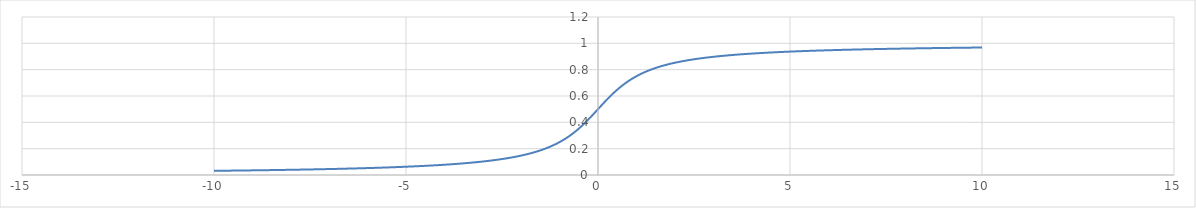
| Category | Series 0 |
|---|---|
| -10.0 | 0.032 |
| -9.9 | 0.032 |
| -9.8 | 0.032 |
| -9.7 | 0.033 |
| -9.6 | 0.033 |
| -9.5 | 0.033 |
| -9.4 | 0.034 |
| -9.3 | 0.034 |
| -9.2 | 0.034 |
| -9.1 | 0.035 |
| -9.0 | 0.035 |
| -8.9 | 0.036 |
| -8.8 | 0.036 |
| -8.7 | 0.036 |
| -8.6 | 0.037 |
| -8.50000000000001 | 0.037 |
| -8.40000000000001 | 0.038 |
| -8.30000000000001 | 0.038 |
| -8.20000000000001 | 0.039 |
| -8.10000000000001 | 0.039 |
| -8.00000000000001 | 0.04 |
| -7.90000000000001 | 0.04 |
| -7.80000000000001 | 0.041 |
| -7.70000000000001 | 0.041 |
| -7.60000000000001 | 0.042 |
| -7.50000000000001 | 0.042 |
| -7.40000000000001 | 0.043 |
| -7.30000000000001 | 0.043 |
| -7.20000000000001 | 0.044 |
| -7.10000000000001 | 0.045 |
| -7.00000000000001 | 0.045 |
| -6.90000000000001 | 0.046 |
| -6.80000000000001 | 0.046 |
| -6.70000000000001 | 0.047 |
| -6.60000000000001 | 0.048 |
| -6.50000000000001 | 0.049 |
| -6.40000000000001 | 0.049 |
| -6.30000000000001 | 0.05 |
| -6.20000000000001 | 0.051 |
| -6.10000000000001 | 0.052 |
| -6.00000000000001 | 0.053 |
| -5.90000000000001 | 0.053 |
| -5.80000000000001 | 0.054 |
| -5.70000000000002 | 0.055 |
| -5.60000000000002 | 0.056 |
| -5.50000000000002 | 0.057 |
| -5.40000000000002 | 0.058 |
| -5.30000000000002 | 0.059 |
| -5.20000000000002 | 0.06 |
| -5.10000000000002 | 0.062 |
| -5.00000000000002 | 0.063 |
| -4.90000000000002 | 0.064 |
| -4.80000000000002 | 0.065 |
| -4.70000000000002 | 0.067 |
| -4.60000000000002 | 0.068 |
| -4.50000000000002 | 0.07 |
| -4.40000000000002 | 0.071 |
| -4.30000000000002 | 0.073 |
| -4.20000000000002 | 0.074 |
| -4.10000000000002 | 0.076 |
| -4.00000000000002 | 0.078 |
| -3.90000000000002 | 0.08 |
| -3.80000000000002 | 0.082 |
| -3.70000000000002 | 0.084 |
| -3.60000000000002 | 0.086 |
| -3.50000000000002 | 0.089 |
| -3.40000000000002 | 0.091 |
| -3.30000000000002 | 0.094 |
| -3.20000000000002 | 0.096 |
| -3.10000000000002 | 0.099 |
| -3.00000000000002 | 0.102 |
| -2.90000000000003 | 0.106 |
| -2.80000000000003 | 0.109 |
| -2.70000000000003 | 0.113 |
| -2.60000000000003 | 0.117 |
| -2.50000000000003 | 0.121 |
| -2.40000000000003 | 0.126 |
| -2.30000000000003 | 0.131 |
| -2.20000000000003 | 0.136 |
| -2.10000000000003 | 0.141 |
| -2.00000000000003 | 0.148 |
| -1.90000000000003 | 0.154 |
| -1.80000000000003 | 0.161 |
| -1.70000000000003 | 0.169 |
| -1.60000000000003 | 0.178 |
| -1.50000000000003 | 0.187 |
| -1.40000000000003 | 0.197 |
| -1.30000000000003 | 0.209 |
| -1.20000000000003 | 0.221 |
| -1.10000000000003 | 0.235 |
| -1.00000000000003 | 0.25 |
| -0.900000000000031 | 0.267 |
| -0.800000000000029 | 0.285 |
| -0.700000000000029 | 0.306 |
| -0.60000000000003 | 0.328 |
| -0.50000000000003 | 0.352 |
| -0.400000000000031 | 0.379 |
| -0.300000000000029 | 0.407 |
| -0.200000000000029 | 0.437 |
| -0.100000000000041 | 0.468 |
| -4.08562073062058e-14 | 0.5 |
| 0.0999999999999996 | 0.532 |
| 0.199999999999999 | 0.563 |
| 0.300000000000001 | 0.593 |
| 0.4 | 0.621 |
| 0.5 | 0.648 |
| 0.6 | 0.672 |
| 0.699999999999999 | 0.694 |
| 0.800000000000001 | 0.715 |
| 0.9 | 0.733 |
| 1.0 | 0.75 |
| 1.1 | 0.765 |
| 1.2 | 0.779 |
| 1.3 | 0.791 |
| 1.4 | 0.803 |
| 1.5 | 0.813 |
| 1.6 | 0.822 |
| 1.7 | 0.831 |
| 1.8 | 0.839 |
| 1.9 | 0.846 |
| 2.0 | 0.852 |
| 2.1 | 0.859 |
| 2.2 | 0.864 |
| 2.3 | 0.869 |
| 2.4 | 0.874 |
| 2.5 | 0.879 |
| 2.6 | 0.883 |
| 2.7 | 0.887 |
| 2.8 | 0.891 |
| 2.9 | 0.894 |
| 3.0 | 0.898 |
| 3.1 | 0.901 |
| 3.2 | 0.904 |
| 3.3 | 0.906 |
| 3.4 | 0.909 |
| 3.5 | 0.911 |
| 3.6 | 0.914 |
| 3.7 | 0.916 |
| 3.8 | 0.918 |
| 3.9 | 0.92 |
| 4.0 | 0.922 |
| 4.0999999999999 | 0.924 |
| 4.1999999999999 | 0.926 |
| 4.2999999999999 | 0.927 |
| 4.3999999999999 | 0.929 |
| 4.4999999999999 | 0.93 |
| 4.5999999999999 | 0.932 |
| 4.6999999999999 | 0.933 |
| 4.7999999999999 | 0.935 |
| 4.8999999999999 | 0.936 |
| 4.9999999999999 | 0.937 |
| 5.0999999999999 | 0.938 |
| 5.1999999999999 | 0.94 |
| 5.2999999999999 | 0.941 |
| 5.3999999999999 | 0.942 |
| 5.4999999999999 | 0.943 |
| 5.5999999999999 | 0.944 |
| 5.6999999999999 | 0.945 |
| 5.7999999999999 | 0.946 |
| 5.8999999999999 | 0.947 |
| 5.9999999999999 | 0.947 |
| 6.0999999999999 | 0.948 |
| 6.1999999999999 | 0.949 |
| 6.2999999999999 | 0.95 |
| 6.3999999999999 | 0.951 |
| 6.4999999999999 | 0.951 |
| 6.5999999999999 | 0.952 |
| 6.6999999999999 | 0.953 |
| 6.7999999999999 | 0.954 |
| 6.8999999999999 | 0.954 |
| 6.9999999999999 | 0.955 |
| 7.0999999999999 | 0.955 |
| 7.1999999999999 | 0.956 |
| 7.2999999999999 | 0.957 |
| 7.3999999999999 | 0.957 |
| 7.4999999999999 | 0.958 |
| 7.5999999999999 | 0.958 |
| 7.6999999999999 | 0.959 |
| 7.7999999999999 | 0.959 |
| 7.8999999999999 | 0.96 |
| 7.9999999999999 | 0.96 |
| 8.0999999999999 | 0.961 |
| 8.1999999999999 | 0.961 |
| 8.2999999999999 | 0.962 |
| 8.3999999999999 | 0.962 |
| 8.4999999999999 | 0.963 |
| 8.5999999999999 | 0.963 |
| 8.6999999999999 | 0.964 |
| 8.7999999999999 | 0.964 |
| 8.8999999999999 | 0.964 |
| 8.9999999999999 | 0.965 |
| 9.0999999999999 | 0.965 |
| 9.1999999999999 | 0.966 |
| 9.2999999999999 | 0.966 |
| 9.3999999999999 | 0.966 |
| 9.4999999999999 | 0.967 |
| 9.5999999999999 | 0.967 |
| 9.6999999999999 | 0.967 |
| 9.7999999999999 | 0.968 |
| 9.8999999999999 | 0.968 |
| 9.9999999999999 | 0.968 |